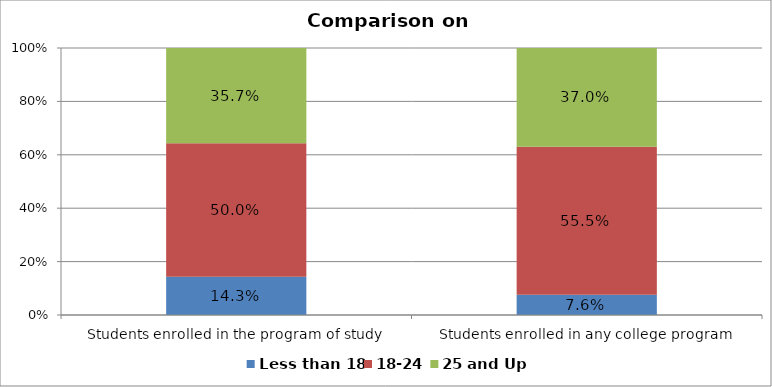
| Category | Less than 18 | 18-24 | 25 and Up |
|---|---|---|---|
| Students enrolled in the program of study | 0.143 | 0.5 | 0.357 |
| Students enrolled in any college program | 0.076 | 0.555 | 0.37 |